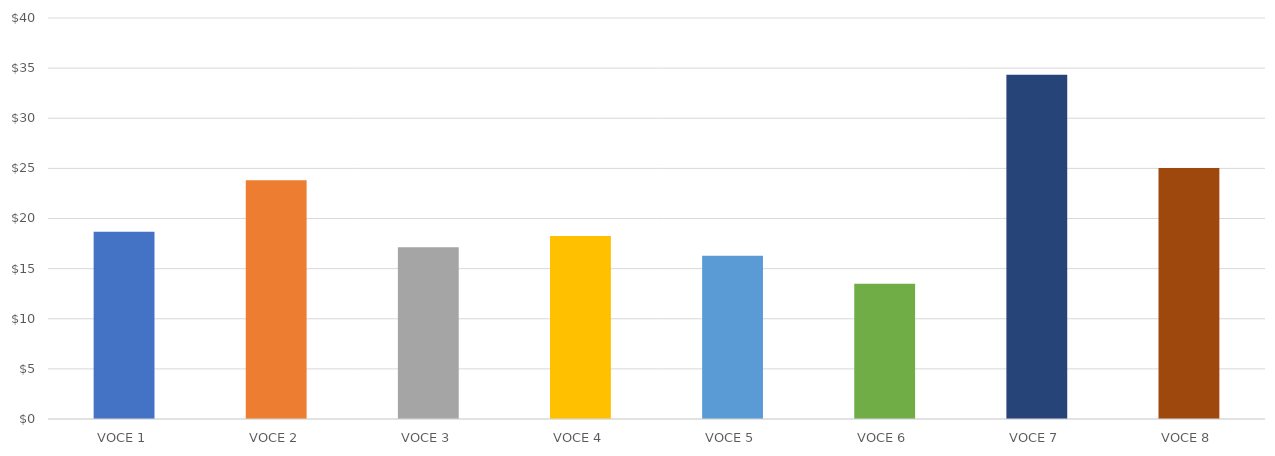
| Category | PROFITTI PER VOCE |
|---|---|
| VOCE 1 | 18.685 |
| VOCE 2 | 23.815 |
| VOCE 3 | 17.125 |
| VOCE 4 | 18.25 |
| VOCE 5 | 16.275 |
| VOCE 6 | 13.5 |
| VOCE 7 | 34.35 |
| VOCE 8 | 25.04 |